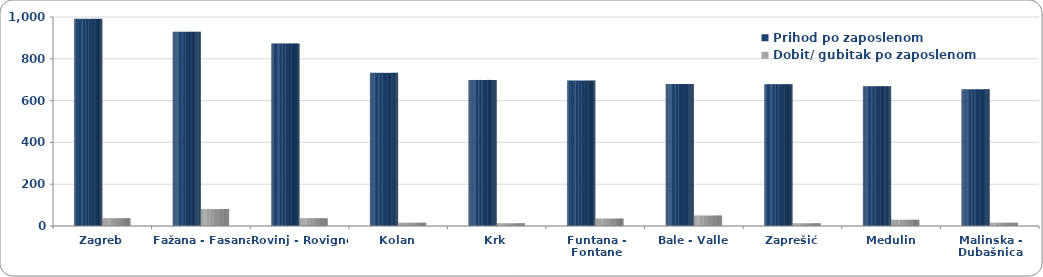
| Category | Prihod po zaposlenom | Dobit/ gubitak po zaposlenom |
|---|---|---|
| Zagreb | 991.306 | 37.595 |
| Fažana - Fasana | 929.396 | 80.946 |
| Rovinj - Rovigno | 873.634 | 37.568 |
| Kolan | 732.673 | 15.932 |
| Krk | 698.947 | 12.901 |
| Funtana - Fontane | 695.874 | 35.482 |
| Bale - Valle | 679.211 | 50.054 |
| Zaprešić | 678.751 | 12.817 |
| Medulin | 668.769 | 29.797 |
| Malinska - Dubašnica | 653.755 | 15.658 |